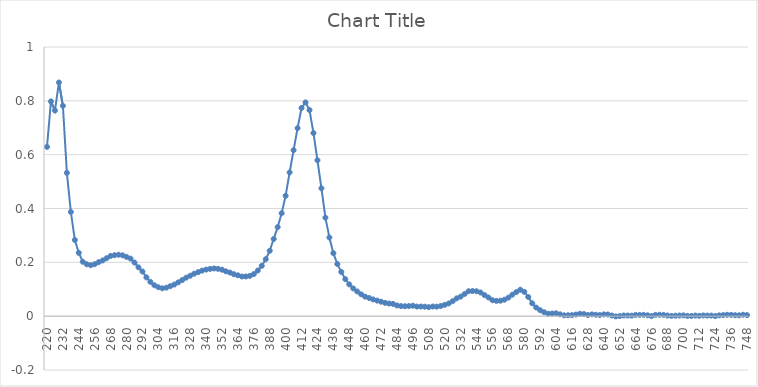
| Category | Series 0 |
|---|---|
| 220.0 | 0.629 |
| 223.0 | 0.798 |
| 226.0 | 0.764 |
| 229.0 | 0.868 |
| 232.0 | 0.781 |
| 235.0 | 0.532 |
| 238.0 | 0.387 |
| 241.0 | 0.283 |
| 244.0 | 0.235 |
| 247.0 | 0.202 |
| 250.0 | 0.193 |
| 253.0 | 0.189 |
| 256.0 | 0.193 |
| 259.0 | 0.201 |
| 262.0 | 0.207 |
| 265.0 | 0.215 |
| 268.0 | 0.224 |
| 271.0 | 0.227 |
| 274.0 | 0.228 |
| 277.0 | 0.226 |
| 280.0 | 0.22 |
| 283.0 | 0.214 |
| 286.0 | 0.199 |
| 289.0 | 0.181 |
| 292.0 | 0.166 |
| 295.0 | 0.144 |
| 298.0 | 0.127 |
| 301.0 | 0.115 |
| 304.0 | 0.107 |
| 307.0 | 0.103 |
| 310.0 | 0.106 |
| 313.0 | 0.111 |
| 316.0 | 0.117 |
| 319.0 | 0.126 |
| 322.0 | 0.134 |
| 325.0 | 0.143 |
| 328.0 | 0.15 |
| 331.0 | 0.158 |
| 334.0 | 0.164 |
| 337.0 | 0.169 |
| 340.0 | 0.173 |
| 343.0 | 0.176 |
| 346.0 | 0.177 |
| 349.0 | 0.176 |
| 352.0 | 0.173 |
| 355.0 | 0.166 |
| 358.0 | 0.162 |
| 361.0 | 0.156 |
| 364.0 | 0.152 |
| 367.0 | 0.147 |
| 370.0 | 0.148 |
| 373.0 | 0.15 |
| 376.0 | 0.156 |
| 379.0 | 0.17 |
| 382.0 | 0.187 |
| 385.0 | 0.212 |
| 388.0 | 0.243 |
| 391.0 | 0.287 |
| 394.0 | 0.331 |
| 397.0 | 0.382 |
| 400.0 | 0.447 |
| 403.0 | 0.534 |
| 406.0 | 0.617 |
| 409.0 | 0.698 |
| 412.0 | 0.773 |
| 415.0 | 0.794 |
| 418.0 | 0.766 |
| 421.0 | 0.68 |
| 424.0 | 0.579 |
| 427.0 | 0.475 |
| 430.0 | 0.366 |
| 433.0 | 0.292 |
| 436.0 | 0.234 |
| 439.0 | 0.194 |
| 442.0 | 0.164 |
| 445.0 | 0.138 |
| 448.0 | 0.118 |
| 451.0 | 0.103 |
| 454.0 | 0.092 |
| 457.0 | 0.081 |
| 460.0 | 0.072 |
| 463.0 | 0.067 |
| 466.0 | 0.062 |
| 469.0 | 0.058 |
| 472.0 | 0.054 |
| 475.0 | 0.049 |
| 478.0 | 0.047 |
| 481.0 | 0.046 |
| 484.0 | 0.04 |
| 487.0 | 0.037 |
| 490.0 | 0.037 |
| 493.0 | 0.038 |
| 496.0 | 0.039 |
| 499.0 | 0.036 |
| 502.0 | 0.036 |
| 505.0 | 0.035 |
| 508.0 | 0.034 |
| 511.0 | 0.036 |
| 514.0 | 0.035 |
| 517.0 | 0.038 |
| 520.0 | 0.042 |
| 523.0 | 0.047 |
| 526.0 | 0.056 |
| 529.0 | 0.066 |
| 532.0 | 0.073 |
| 535.0 | 0.082 |
| 538.0 | 0.093 |
| 541.0 | 0.093 |
| 544.0 | 0.093 |
| 547.0 | 0.088 |
| 550.0 | 0.078 |
| 553.0 | 0.069 |
| 556.0 | 0.059 |
| 559.0 | 0.057 |
| 562.0 | 0.057 |
| 565.0 | 0.061 |
| 568.0 | 0.069 |
| 571.0 | 0.08 |
| 574.0 | 0.09 |
| 577.0 | 0.098 |
| 580.0 | 0.09 |
| 583.0 | 0.071 |
| 586.0 | 0.048 |
| 589.0 | 0.032 |
| 592.0 | 0.022 |
| 595.0 | 0.015 |
| 598.0 | 0.009 |
| 601.0 | 0.01 |
| 604.0 | 0.011 |
| 607.0 | 0.007 |
| 610.0 | 0.003 |
| 613.0 | 0.003 |
| 616.0 | 0.004 |
| 619.0 | 0.006 |
| 622.0 | 0.009 |
| 625.0 | 0.008 |
| 628.0 | 0.004 |
| 631.0 | 0.007 |
| 634.0 | 0.005 |
| 637.0 | 0.004 |
| 640.0 | 0.007 |
| 643.0 | 0.006 |
| 646.0 | 0.002 |
| 649.0 | -0.001 |
| 652.0 | 0 |
| 655.0 | 0.003 |
| 658.0 | 0.002 |
| 661.0 | 0.002 |
| 664.0 | 0.005 |
| 667.0 | 0.005 |
| 670.0 | 0.005 |
| 673.0 | 0.003 |
| 676.0 | 0 |
| 679.0 | 0.005 |
| 682.0 | 0.005 |
| 685.0 | 0.005 |
| 688.0 | 0.002 |
| 691.0 | 0.001 |
| 694.0 | 0.002 |
| 697.0 | 0.002 |
| 700.0 | 0.003 |
| 703.0 | 0.001 |
| 706.0 | 0.001 |
| 709.0 | 0.002 |
| 712.0 | 0.001 |
| 715.0 | 0.003 |
| 718.0 | 0.002 |
| 721.0 | 0.002 |
| 724.0 | 0 |
| 727.0 | 0.003 |
| 730.0 | 0.004 |
| 733.0 | 0.005 |
| 736.0 | 0.005 |
| 739.0 | 0.004 |
| 742.0 | 0.003 |
| 745.0 | 0.005 |
| 748.0 | 0.004 |